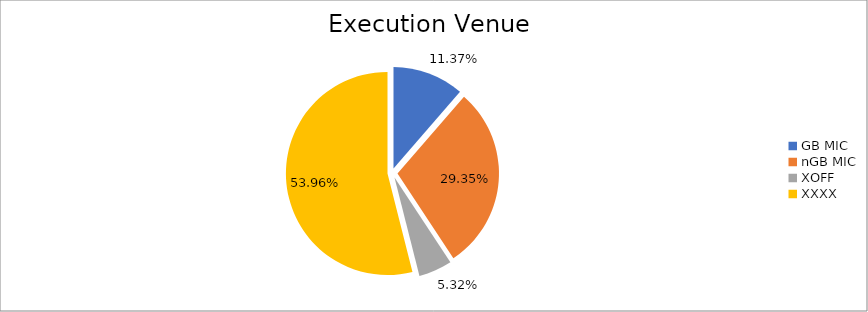
| Category | Series 0 |
|---|---|
| GB MIC | 1118310.489 |
| nGB MIC | 2886794.672 |
| XOFF | 523274.992 |
| XXXX | 5306894.985 |